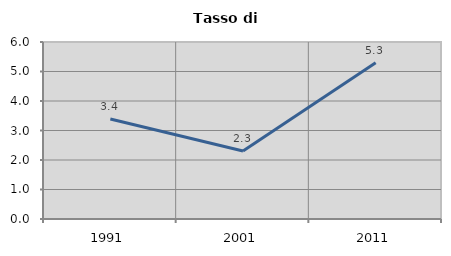
| Category | Tasso di disoccupazione   |
|---|---|
| 1991.0 | 3.39 |
| 2001.0 | 2.303 |
| 2011.0 | 5.294 |